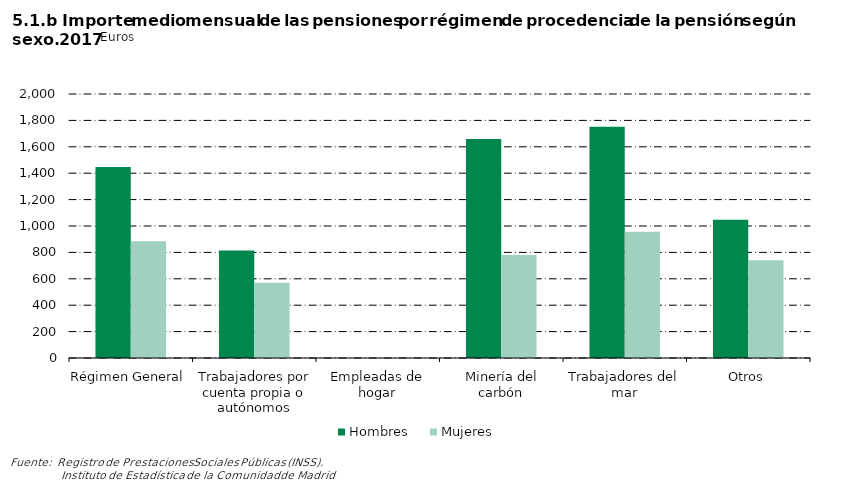
| Category | Hombres | Mujeres |
|---|---|---|
| Régimen General | 1446.397 | 884.685 |
| Trabajadores por cuenta propia o autónomos | 813.845 | 569.873 |
| Empleadas de hogar | 0 | 0 |
| Minería del carbón | 1659.601 | 779.883 |
| Trabajadores del mar | 1751.601 | 955.648 |
| Otros | 1048.129 | 739.822 |